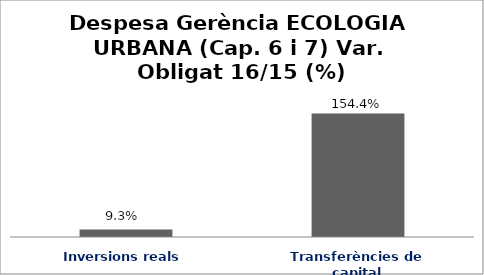
| Category | Series 0 |
|---|---|
| Inversions reals | 0.093 |
| Transferències de capital | 1.544 |